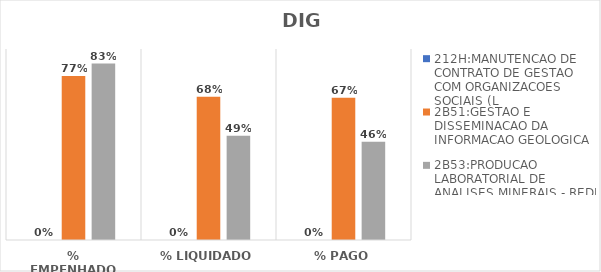
| Category | 212H:MANUTENCAO DE CONTRATO DE GESTAO COM ORGANIZACOES SOCIAIS (L | 2B51:GESTAO E DISSEMINACAO DA INFORMACAO GEOLOGICA | 2B53:PRODUCAO LABORATORIAL DE ANALISES MINERAIS - REDE LAMIN |
|---|---|---|---|
| % EMPENHADO | 0 | 0.772 | 0.832 |
| % LIQUIDADO | 0 | 0.675 | 0.491 |
| % PAGO | 0 | 0.67 | 0.463 |